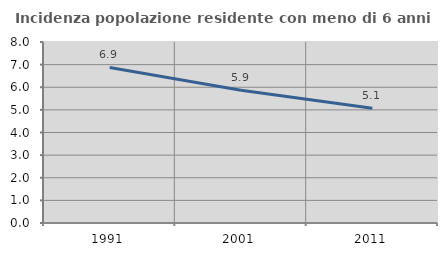
| Category | Incidenza popolazione residente con meno di 6 anni |
|---|---|
| 1991.0 | 6.874 |
| 2001.0 | 5.871 |
| 2011.0 | 5.073 |